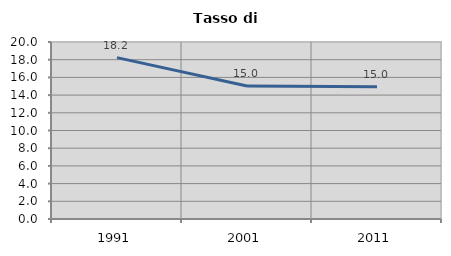
| Category | Tasso di disoccupazione   |
|---|---|
| 1991.0 | 18.236 |
| 2001.0 | 15.027 |
| 2011.0 | 14.956 |